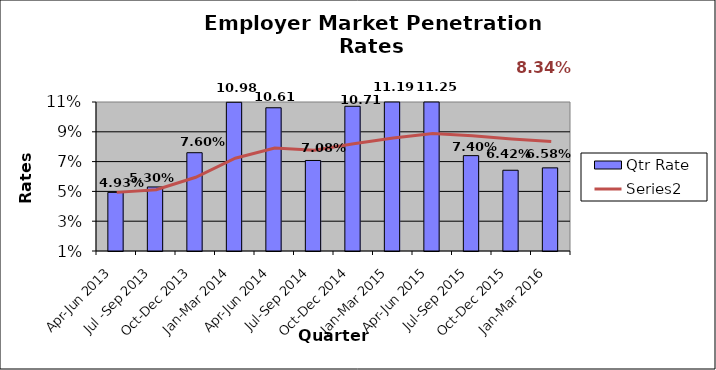
| Category | Qtr Rate |
|---|---|
| Apr-Jun 2013 | 0.049 |
| Jul -Sep 2013 | 0.053 |
| Oct-Dec 2013 | 0.076 |
| Jan-Mar 2014 | 0.11 |
| Apr-Jun 2014 | 0.106 |
| Jul-Sep 2014 | 0.071 |
| Oct-Dec 2014 | 0.107 |
| Jan-Mar 2015 | 0.112 |
| Apr-Jun 2015 | 0.112 |
| Jul-Sep 2015 | 0.074 |
| Oct-Dec 2015 | 0.064 |
| Jan-Mar 2016 | 0.066 |